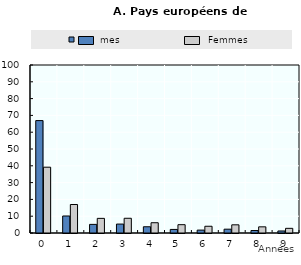
| Category | Hommes | Femmes |
|---|---|---|
| 0.0 | 66.918 | 39.174 |
| 1.0 | 10.121 | 16.96 |
| 2.0 | 5.128 | 8.71 |
| 3.0 | 5.316 | 8.769 |
| 4.0 | 3.712 | 6.112 |
| 5.0 | 2.127 | 4.95 |
| 6.0 | 1.729 | 4.013 |
| 7.0 | 2.273 | 4.866 |
| 8.0 | 1.471 | 3.668 |
| 9.0 | 1.205 | 2.778 |